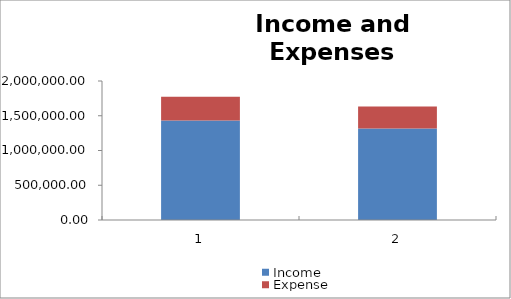
| Category | Income | Expense |
|---|---|---|
| 0 | 1432500 | 339760 |
| 1 | 1318080 | 314910 |